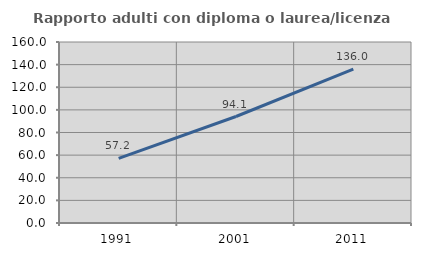
| Category | Rapporto adulti con diploma o laurea/licenza media  |
|---|---|
| 1991.0 | 57.202 |
| 2001.0 | 94.137 |
| 2011.0 | 136.042 |